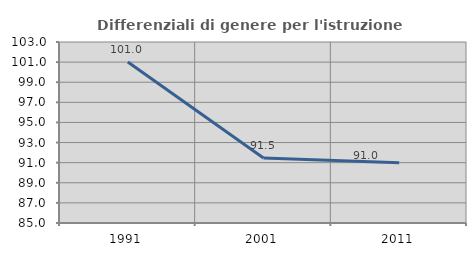
| Category | Differenziali di genere per l'istruzione superiore |
|---|---|
| 1991.0 | 101.011 |
| 2001.0 | 91.458 |
| 2011.0 | 90.989 |